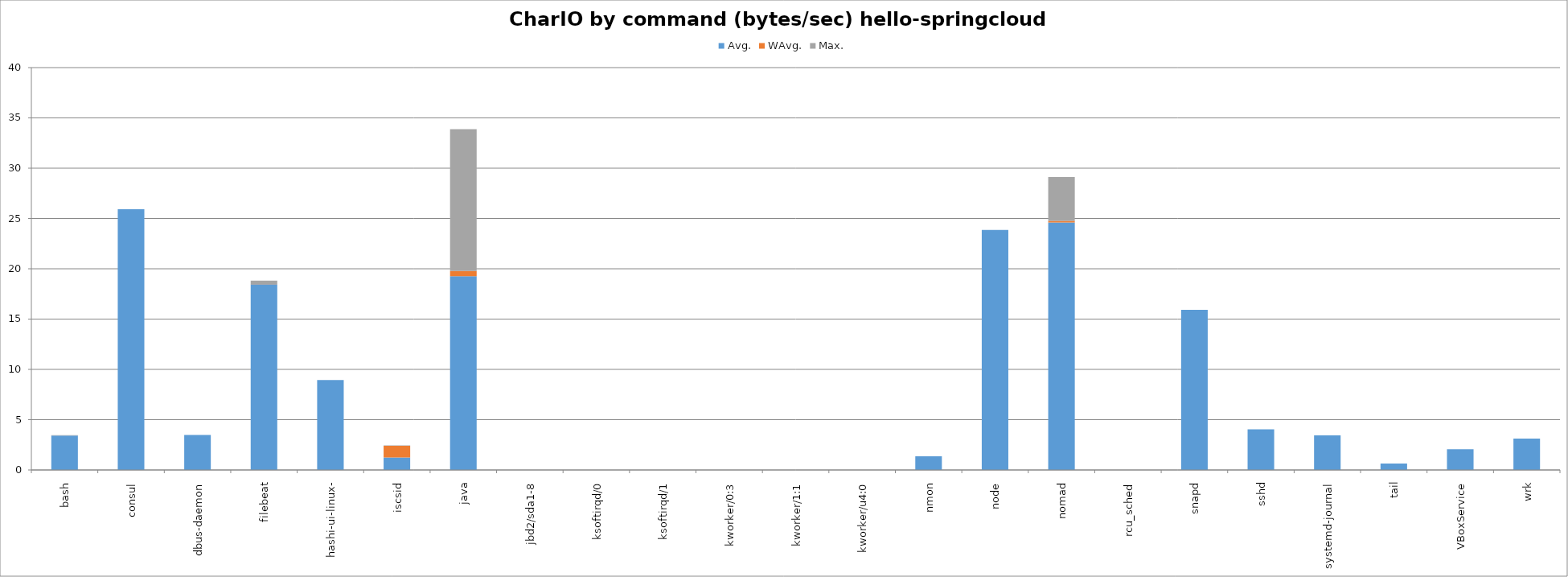
| Category | Avg. | WAvg. | Max. |
|---|---|---|---|
| bash | 3418.667 | 0.999 | 40.334 |
| consul | 25912 | 0 | 0 |
| dbus-daemon | 3484 | 0 | 0 |
| filebeat | 18469.774 | 3.726 | 350.5 |
| hashi-ui-linux- | 8940 | 0 | 0 |
| iscsid | 1236 | 1165.049 | 34.951 |
| java | 19266.963 | 508.192 | 14096.845 |
| jbd2/sda1-8 | 0 | 0 | 0 |
| ksoftirqd/0 | 0 | 0 | 0 |
| ksoftirqd/1 | 0 | 0 | 0 |
| kworker/0:3 | 0 | 0 | 0 |
| kworker/1:1 | 0 | 0 | 0 |
| kworker/u4:0 | 0 | 0 | 0 |
| nmon | 1364 | 0 | 0 |
| node | 23852 | 0 | 0 |
| nomad | 24597.516 | 169.288 | 4357.195 |
| rcu_sched | 0 | 0 | 0 |
| snapd | 15920 | 0 | 0 |
| sshd | 4036 | 0 | 0 |
| systemd-journal | 3444 | 0 | 0 |
| tail | 644 | 0 | 0 |
| VBoxService | 2064 | 0 | 0 |
| wrk | 3124 | 0 | 0 |